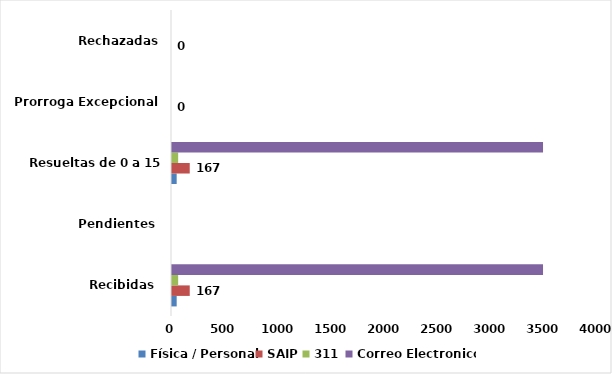
| Category | Física / Personal | SAIP | 311 | Correo Electronico |
|---|---|---|---|---|
| Recibidas  | 44 | 167 | 58 | 3492 |
| Pendientes  | 0 | 0 | 0 | 0 |
| Resueltas de 0 a 15 dias | 44 | 167 | 58 | 3492 |
| Prorroga Excepcional | 0 | 0 | 0 | 0 |
| Rechazadas | 0 | 0 | 0 | 0 |